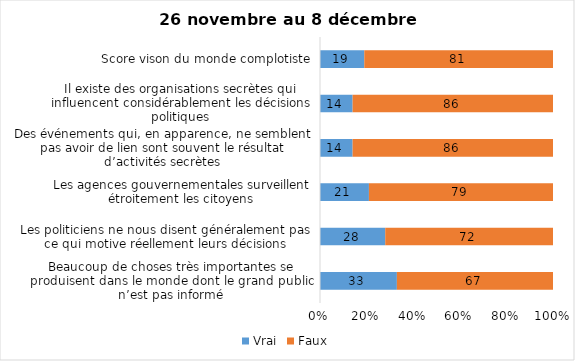
| Category | Vrai | Faux |
|---|---|---|
| Beaucoup de choses très importantes se produisent dans le monde dont le grand public n’est pas informé | 33 | 67 |
| Les politiciens ne nous disent généralement pas ce qui motive réellement leurs décisions | 28 | 72 |
| Les agences gouvernementales surveillent étroitement les citoyens | 21 | 79 |
| Des événements qui, en apparence, ne semblent pas avoir de lien sont souvent le résultat d’activités secrètes | 14 | 86 |
| Il existe des organisations secrètes qui influencent considérablement les décisions politiques | 14 | 86 |
| Score vison du monde complotiste | 19 | 81 |